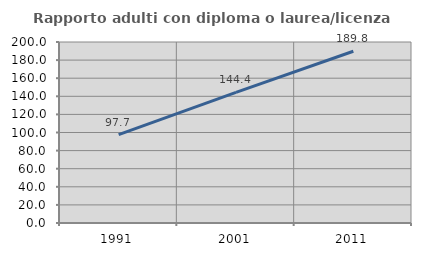
| Category | Rapporto adulti con diploma o laurea/licenza media  |
|---|---|
| 1991.0 | 97.727 |
| 2001.0 | 144.422 |
| 2011.0 | 189.783 |